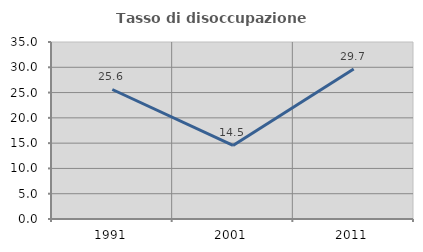
| Category | Tasso di disoccupazione giovanile  |
|---|---|
| 1991.0 | 25.61 |
| 2001.0 | 14.545 |
| 2011.0 | 29.67 |